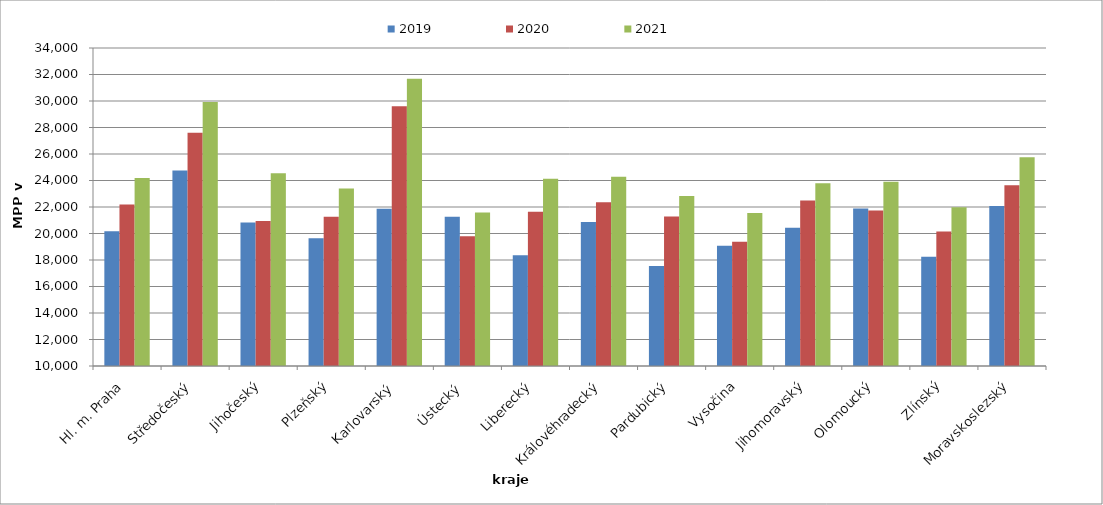
| Category | 2019 | 2020 | 2021 |
|---|---|---|---|
| Hl. m. Praha | 20168.824 | 22183.455 | 24181.204 |
| Středočeský | 24762.069 | 27608.276 | 29920.457 |
| Jihočeský | 20838.484 | 20935.362 | 24553.209 |
| Plzeňský | 19648.79 | 21270.812 | 23398.007 |
| Karlovarský  | 21866.667 | 29600 | 31680 |
| Ústecký   | 21267.487 | 19799.392 | 21581.155 |
| Liberecký | 18349.962 | 21639.233 | 24141.128 |
| Královéhradecký | 20861.538 | 22367.023 | 24287.93 |
| Pardubický | 17554.541 | 21283.708 | 22826.306 |
| Vysočina | 19073.13 | 19373.961 | 21549.017 |
| Jihomoravský | 20433.667 | 22481.964 | 23794.389 |
| Olomoucký | 21889.046 | 21731.499 | 23904.472 |
| Zlínský | 18236.08 | 20152.306 | 21975.339 |
| Moravskoslezský | 22076.632 | 23636.364 | 25757.576 |